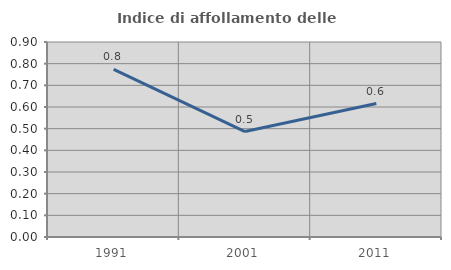
| Category | Indice di affollamento delle abitazioni  |
|---|---|
| 1991.0 | 0.773 |
| 2001.0 | 0.487 |
| 2011.0 | 0.616 |